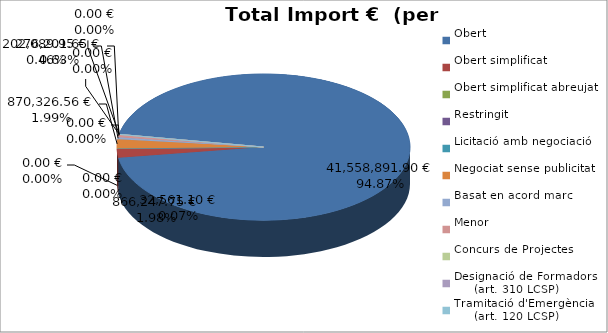
| Category | Total preu
(amb IVA) |
|---|---|
| Obert | 41558891.897 |
| Obert simplificat | 866247.748 |
| Obert simplificat abreujat | 32561.1 |
| Restringit | 0 |
| Licitació amb negociació | 0 |
| Negociat sense publicitat | 870326.562 |
| Basat en acord marc | 202089.954 |
| Menor | 276201.653 |
| Concurs de Projectes | 0 |
| Designació de Formadors
     (art. 310 LCSP) | 0 |
| Tramitació d'Emergència
     (art. 120 LCSP) | 0 |